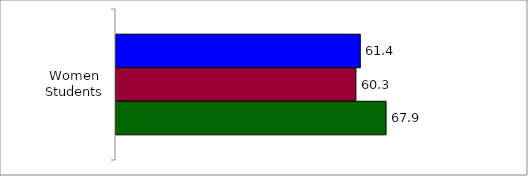
| Category | 50 States and D.C. | SREB States | State |
|---|---|---|---|
| Women Students | 61.381 | 60.278 | 67.852 |